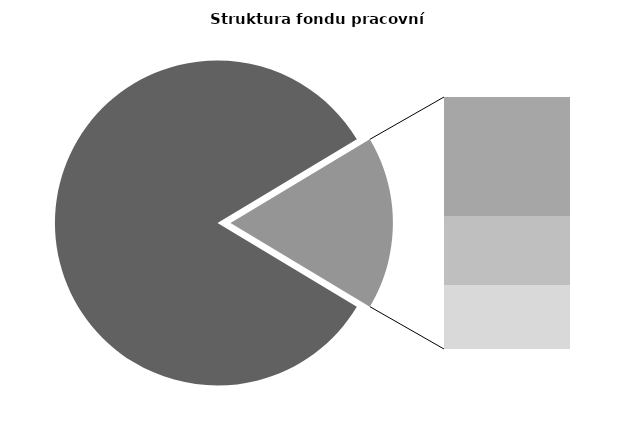
| Category | Series 0 |
|---|---|
| Průměrná měsíční odpracovaná doba bez přesčasu | 140.989 |
| Dovolená | 13.93 |
| Nemoc | 7.928 |
| Jiné | 7.447 |